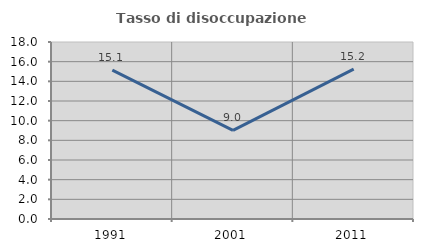
| Category | Tasso di disoccupazione giovanile  |
|---|---|
| 1991.0 | 15.144 |
| 2001.0 | 9.013 |
| 2011.0 | 15.239 |